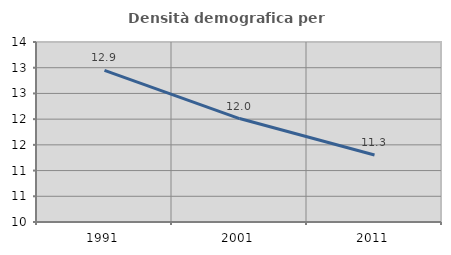
| Category | Densità demografica |
|---|---|
| 1991.0 | 12.949 |
| 2001.0 | 12.011 |
| 2011.0 | 11.303 |